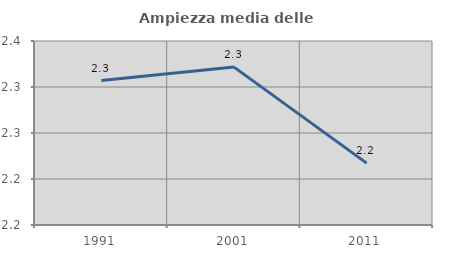
| Category | Ampiezza media delle famiglie |
|---|---|
| 1991.0 | 2.307 |
| 2001.0 | 2.322 |
| 2011.0 | 2.217 |